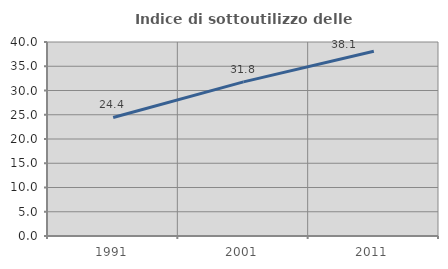
| Category | Indice di sottoutilizzo delle abitazioni  |
|---|---|
| 1991.0 | 24.444 |
| 2001.0 | 31.773 |
| 2011.0 | 38.095 |